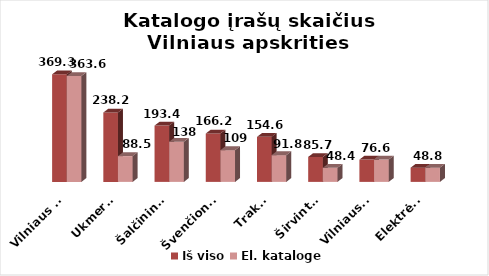
| Category | Iš viso | El. kataloge |
|---|---|---|
| Vilniaus m. | 369.3 | 363.6 |
| Ukmergė | 238.2 | 88.5 |
| Šalčininkai | 193.4 | 138 |
| Švenčionys | 166.2 | 109 |
| Trakai | 154.6 | 91.8 |
| Širvintos | 85.7 | 48.4 |
| Vilniaus r. | 76.6 | 76.6 |
| Elektrėnai | 48.8 | 48.8 |